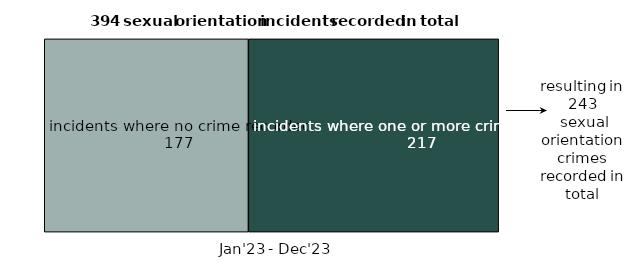
| Category | incidents where no crime recorded | incidents where one or more crimes recorded |
|---|---|---|
| 0 | 177 | 217 |